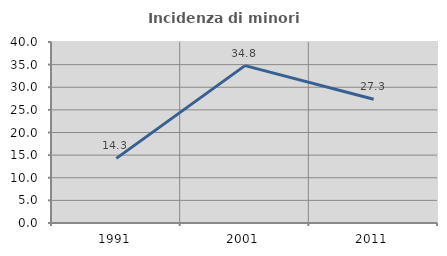
| Category | Incidenza di minori stranieri |
|---|---|
| 1991.0 | 14.286 |
| 2001.0 | 34.783 |
| 2011.0 | 27.333 |